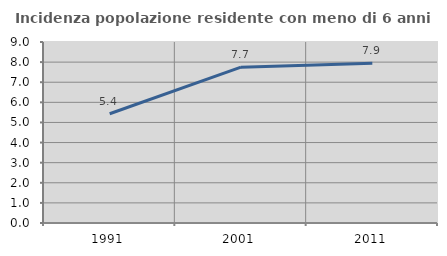
| Category | Incidenza popolazione residente con meno di 6 anni |
|---|---|
| 1991.0 | 5.434 |
| 2001.0 | 7.748 |
| 2011.0 | 7.945 |